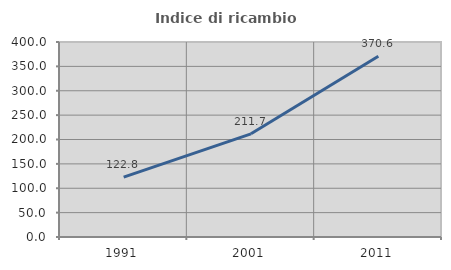
| Category | Indice di ricambio occupazionale  |
|---|---|
| 1991.0 | 122.785 |
| 2001.0 | 211.688 |
| 2011.0 | 370.588 |